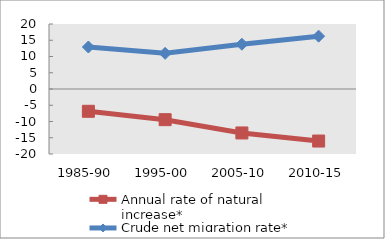
| Category | Annual rate of natural increase* | Crude net migration rate* |
|---|---|---|
| 1985-90 | -6.856 | 12.92 |
| 1995-00 | -9.439 | 10.969 |
| 2005-10 | -13.525 | 13.776 |
| 2010-15 | -16.01 | 16.26 |